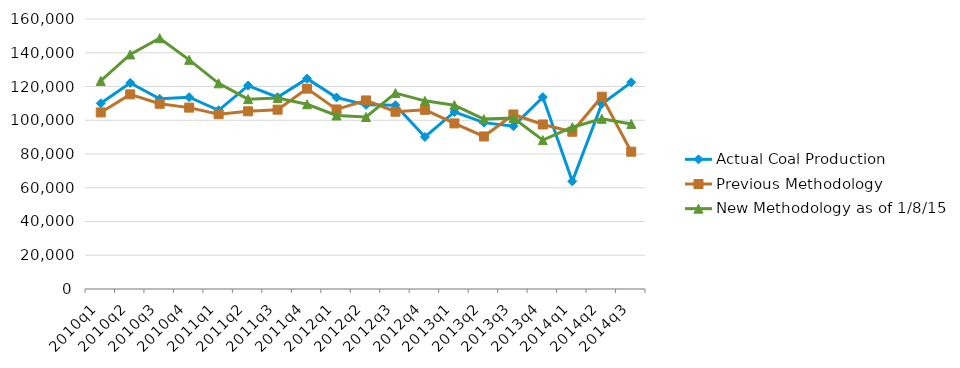
| Category | Actual Coal Production | Previous Methodology | New Methodology as of 1/8/15 |
|---|---|---|---|
| 2010q1 | 110024 | 104633 | 123325 |
| 2010q2 | 122102 | 115343 | 139001 |
| 2010q3 | 112681 | 109781 | 148593 |
| 2010q4 | 113670 | 107483 | 135808 |
| 2011q1 | 105910 | 103588 | 121886 |
| 2011q2 | 120521 | 105317 | 112511 |
| 2011q3 | 113650 | 106259 | 113226 |
| 2011q4 | 124657 | 118728 | 109464 |
| 2012q1 | 113483 | 106389 | 102823 |
| 2012q2 | 109129 | 111741 | 101942 |
| 2012q3 | 108881 | 105054 | 116099 |
| 2012q4 | 90094 | 106173 | 111493 |
| 2013q1 | 104918 | 98121 | 108947 |
| 2013q2 | 98594 | 90391 | 100672 |
| 2013q3 | 96488 | 103423 | 101329 |
| 2013q4 | 113703 | 97495 | 88229 |
| 2014q1 | 63811 | 93186 | 95889 |
| 2014q2 | 109678 | 113948 | 100890 |
| 2014q3 | 122455 | 81377 | 97827 |